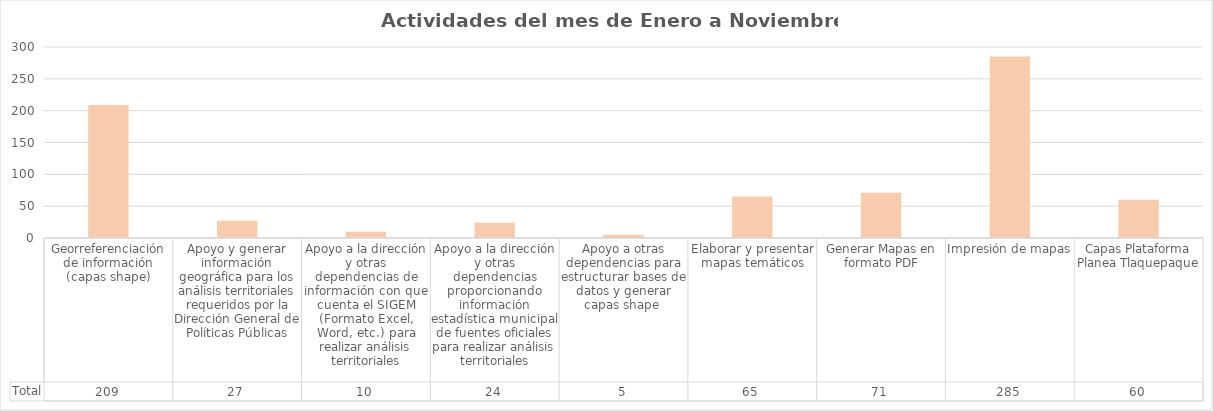
| Category | Total |
|---|---|
| Georreferenciación de información (capas shape) | 209 |
| Apoyo y generar información geográfica para los análisis territoriales requeridos por la Dirección General de Políticas Públicas | 27 |
| Apoyo a la dirección y otras dependencias de información con que cuenta el SIGEM (Formato Excel, Word, etc.) para realizar análisis territoriales | 10 |
| Apoyo a la dirección y otras dependencias proporcionando información estadística municipal de fuentes oficiales para realizar análisis territoriales | 24 |
| Apoyo a otras dependencias para estructurar bases de datos y generar capas shape  | 5 |
| Elaborar y presentar mapas temáticos | 65 |
| Generar Mapas en formato PDF | 71 |
| Impresión de mapas | 285 |
| Capas Plataforma Planea Tlaquepaque | 60 |